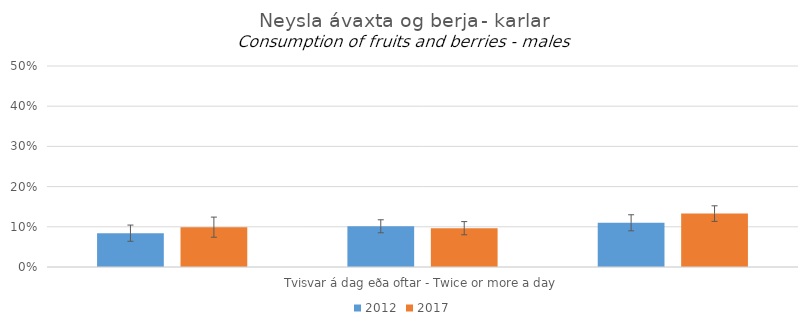
| Category | 2012 | 2017 |
|---|---|---|
| 0 | 0.084 | 0.099 |
| 1 | 0.101 | 0.097 |
| 2 | 0.11 | 0.133 |